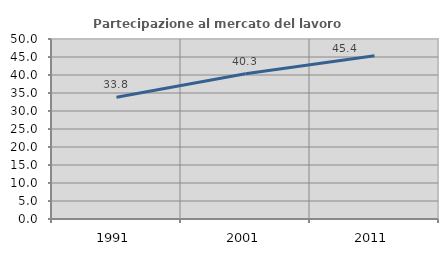
| Category | Partecipazione al mercato del lavoro  femminile |
|---|---|
| 1991.0 | 33.831 |
| 2001.0 | 40.349 |
| 2011.0 | 45.372 |